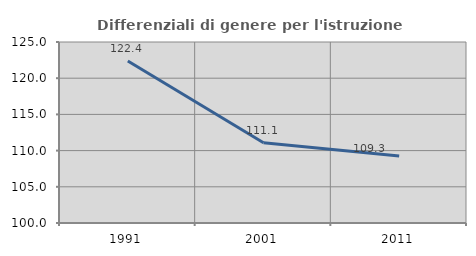
| Category | Differenziali di genere per l'istruzione superiore |
|---|---|
| 1991.0 | 122.387 |
| 2001.0 | 111.078 |
| 2011.0 | 109.269 |